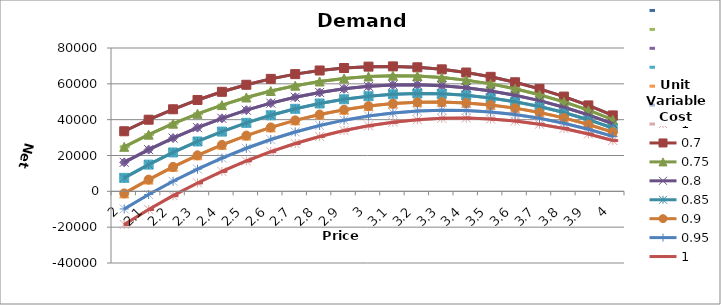
| Category | 0.7 | 0.75 | 0.8 | 0.85 | 0.9 | 0.95 | 1 |
|---|---|---|---|---|---|---|---|
| 2.0 | 33525.316 | 24854.43 | 16183.544 | 7512.658 | -1158.228 | -9829.114 | -18500 |
| 2.1 | 39981.013 | 31626.582 | 23272.152 | 14917.722 | 6563.291 | -1791.139 | -10145.57 |
| 2.2 | 45803.797 | 37765.823 | 29727.848 | 21689.873 | 13651.899 | 5613.924 | -2424.051 |
| 2.3 | 50993.671 | 43272.152 | 35550.633 | 27829.114 | 20107.595 | 12386.076 | 4664.557 |
| 2.4 | 55550.633 | 48145.57 | 40740.506 | 33335.443 | 25930.38 | 18525.316 | 11120.253 |
| 2.5 | 59474.684 | 52386.076 | 45297.468 | 38208.861 | 31120.253 | 24031.646 | 16943.038 |
| 2.6 | 62765.823 | 55993.671 | 49221.519 | 42449.367 | 35677.215 | 28905.063 | 22132.911 |
| 2.7 | 65424.051 | 58968.354 | 52512.658 | 46056.962 | 39601.266 | 33145.57 | 26689.873 |
| 2.8 | 67449.367 | 61310.127 | 55170.886 | 49031.646 | 42892.405 | 36753.165 | 30613.924 |
| 2.9 | 68841.772 | 63018.987 | 57196.203 | 51373.418 | 45550.633 | 39727.848 | 33905.063 |
| 3.0 | 69601.266 | 64094.937 | 58588.608 | 53082.278 | 47575.949 | 42069.62 | 36563.291 |
| 3.1 | 69727.848 | 64537.975 | 59348.101 | 54158.228 | 48968.354 | 43778.481 | 38588.608 |
| 3.2 | 69221.519 | 64348.101 | 59474.684 | 54601.266 | 49727.848 | 44854.43 | 39981.013 |
| 3.3 | 68082.278 | 63525.316 | 58968.354 | 54411.392 | 49854.43 | 45297.468 | 40740.506 |
| 3.4 | 66310.127 | 62069.62 | 57829.114 | 53588.608 | 49348.101 | 45107.595 | 40867.089 |
| 3.5 | 63905.063 | 59981.013 | 56056.962 | 52132.911 | 48208.861 | 44284.81 | 40360.759 |
| 3.6 | 60867.089 | 57259.494 | 53651.899 | 50044.304 | 46436.709 | 42829.114 | 39221.519 |
| 3.7 | 57196.203 | 53905.063 | 50613.924 | 47322.785 | 44031.646 | 40740.506 | 37449.367 |
| 3.8 | 52892.405 | 49917.722 | 46943.038 | 43968.354 | 40993.671 | 38018.987 | 35044.304 |
| 3.9 | 47955.696 | 45297.468 | 42639.241 | 39981.013 | 37322.785 | 34664.557 | 32006.329 |
| 4.0 | 42386.076 | 40044.304 | 37702.532 | 35360.759 | 33018.987 | 30677.215 | 28335.443 |